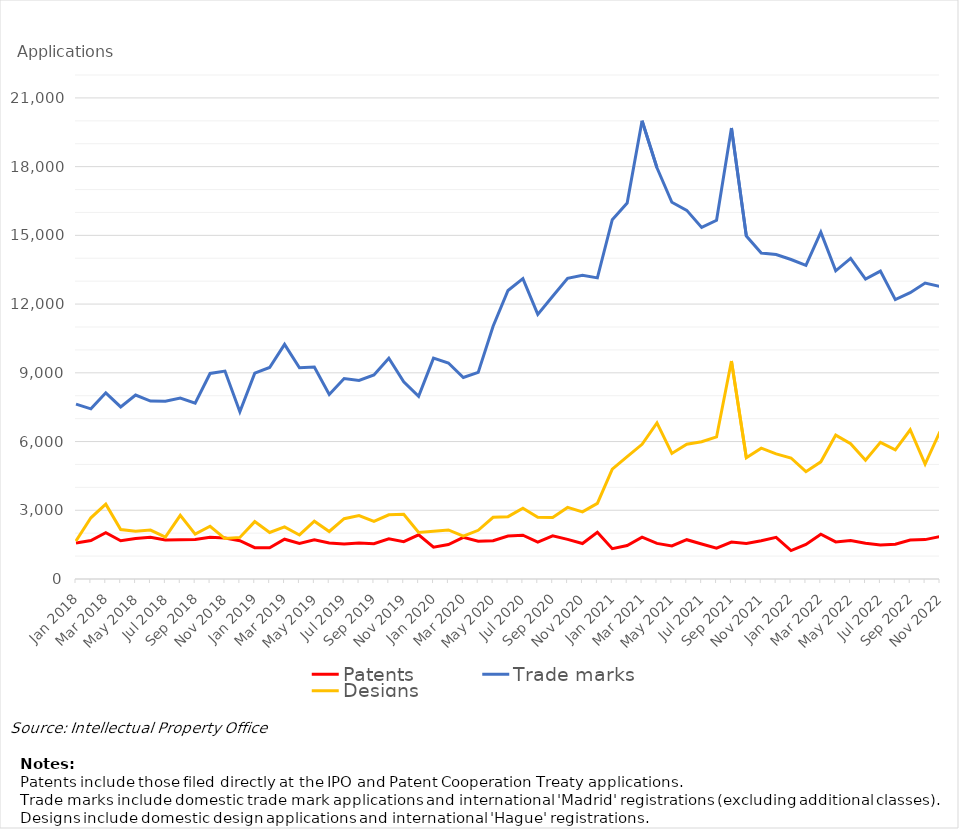
| Category | Patents | Trade marks | Designs |
|---|---|---|---|
| Jan 2018 | 1575 | 7634 | 1658 |
| Feb 2018 | 1676 | 7428 | 2672 |
| Mar 2018 | 2022 | 8127 | 3267 |
| Apr 2018 | 1670 | 7512 | 2160 |
| May 2018 | 1767 | 8030 | 2083 |
| Jun 2018 | 1821 | 7769 | 2136 |
| Jul 2018 | 1704 | 7757 | 1832 |
| Aug 2018 | 1713 | 7897 | 2777 |
| Sep 2018 | 1725 | 7673 | 1960 |
| Oct 2018 | 1818 | 8972 | 2302 |
| Nov 2018 | 1787 | 9076 | 1765 |
| Dec 2018 | 1670 | 7304 | 1815 |
| Jan 2019 | 1367 | 8985 | 2505 |
| Feb 2019 | 1361 | 9234 | 2031 |
| Mar 2019 | 1737 | 10243 | 2274 |
| Apr 2019 | 1552 | 9219 | 1923 |
| May 2019 | 1710 | 9251 | 2520 |
| Jun 2019 | 1569 | 8053 | 2074 |
| Jul 2019 | 1527 | 8752 | 2634 |
| Aug 2019 | 1571 | 8670 | 2768 |
| Sep 2019 | 1540 | 8907 | 2511 |
| Oct 2019 | 1755 | 9636 | 2800 |
| Nov 2019 | 1630 | 8607 | 2827 |
| Dec 2019 | 1926 | 7970 | 2028 |
| Jan 2020 | 1391 | 9642 | 2082 |
| Feb 2020 | 1504 | 9428 | 2143 |
| Mar 2020 | 1819 | 8794 | 1872 |
| Apr 2020 | 1648 | 9021 | 2127 |
| May 2020 | 1672 | 11035 | 2695 |
| Jun 2020 | 1879 | 12593 | 2721 |
| Jul 2020 | 1912 | 13110 | 3086 |
| Aug 2020 | 1614 | 11551 | 2695 |
| Sep 2020 | 1885 | 12340 | 2686 |
| Oct 2020 | 1730 | 13126 | 3124 |
| Nov 2020 | 1547 | 13254 | 2930 |
| Dec 2020 | 2042 | 13144 | 3302 |
| Jan 2021 | 1324 | 15685 | 4792 |
| Feb 2021 | 1462 | 16412 | 5340 |
| Mar 2021 | 1828 | 20001 | 5878 |
| Apr 2021 | 1554 | 17951 | 6815 |
| May 2021 | 1446 | 16446 | 5480 |
| Jun 2021 | 1716 | 16091 | 5881 |
| Jul 2021 | 1528 | 15345 | 5989 |
| Aug 2021 | 1344 | 15659 | 6200 |
| Sep 2021 | 1615 | 19685 | 9517 |
| Oct 2021 | 1547 | 14968 | 5292 |
| Nov 2021 | 1670 | 14232 | 5712 |
| Dec 2021 | 1818 | 14162 | 5464 |
| Jan 2022 | 1240 | 13945 | 5282 |
| Feb 2022 | 1507 | 13691 | 4683 |
| Mar 2022 | 1952 | 15142 | 5114 |
| Apr 2022 | 1617 | 13450 | 6282 |
| May 2022 | 1681 | 13992 | 5907 |
| Jun 2022 | 1559 | 13095 | 5183 |
| Jul 2022 | 1486 | 13439 | 5963 |
| Aug 2022 | 1519 | 12197 | 5639 |
| Sep 2022 | 1702 | 12496 | 6514 |
| Oct 2022 | 1719 | 12916 | 5012 |
| Nov 2022 | 1856 | 12768 | 6436 |